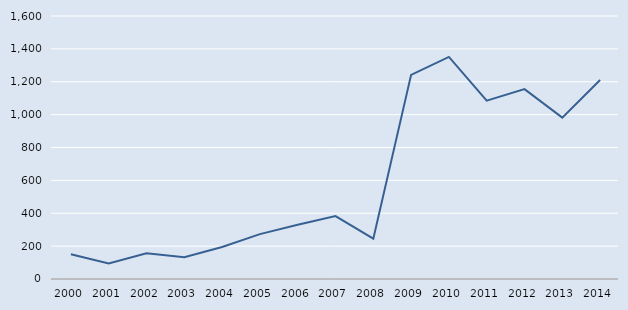
| Category | Series 0 |
|---|---|
| 2000.0 | 150 |
| 2001.0 | 94 |
| 2002.0 | 157 |
| 2003.0 | 132 |
| 2004.0 | 195 |
| 2005.0 | 273 |
| 2006.0 | 330 |
| 2007.0 | 383 |
| 2008.0 | 245 |
| 2009.0 | 1242 |
| 2010.0 | 1351 |
| 2011.0 | 1085 |
| 2012.0 | 1155 |
| 2013.0 | 982 |
| 2014.0 | 1211 |